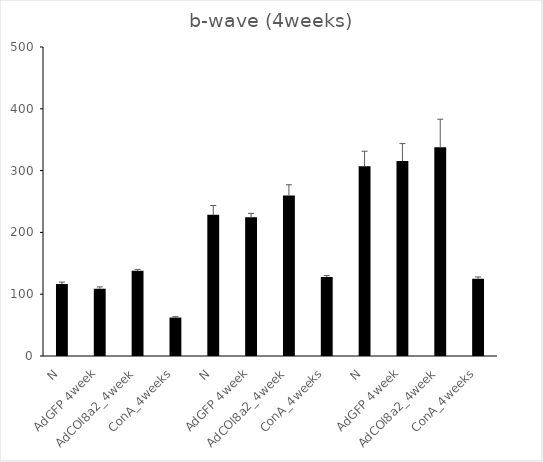
| Category | Series 0 |
|---|---|
| N | 116.457 |
| AdGFP 4week | 108.817 |
| AdCOl8a2_4week | 137.8 |
| ConA_4weeks | 62.2 |
| N | 228.45 |
| AdGFP 4week | 224.433 |
| AdCOl8a2_4week | 259.65 |
| ConA_4weeks | 128 |
| N | 306.907 |
| AdGFP 4week | 315.433 |
| AdCOl8a2_4week | 337.7 |
| ConA_4weeks | 125.1 |